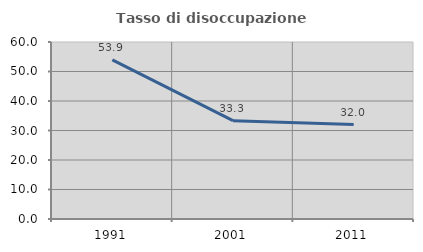
| Category | Tasso di disoccupazione giovanile  |
|---|---|
| 1991.0 | 53.939 |
| 2001.0 | 33.333 |
| 2011.0 | 32 |